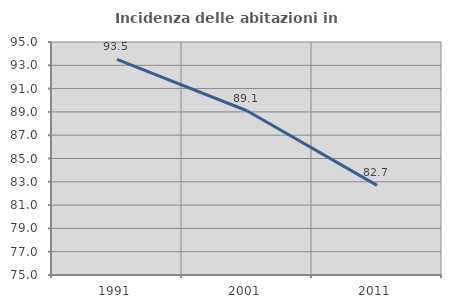
| Category | Incidenza delle abitazioni in proprietà  |
|---|---|
| 1991.0 | 93.5 |
| 2001.0 | 89.1 |
| 2011.0 | 82.692 |